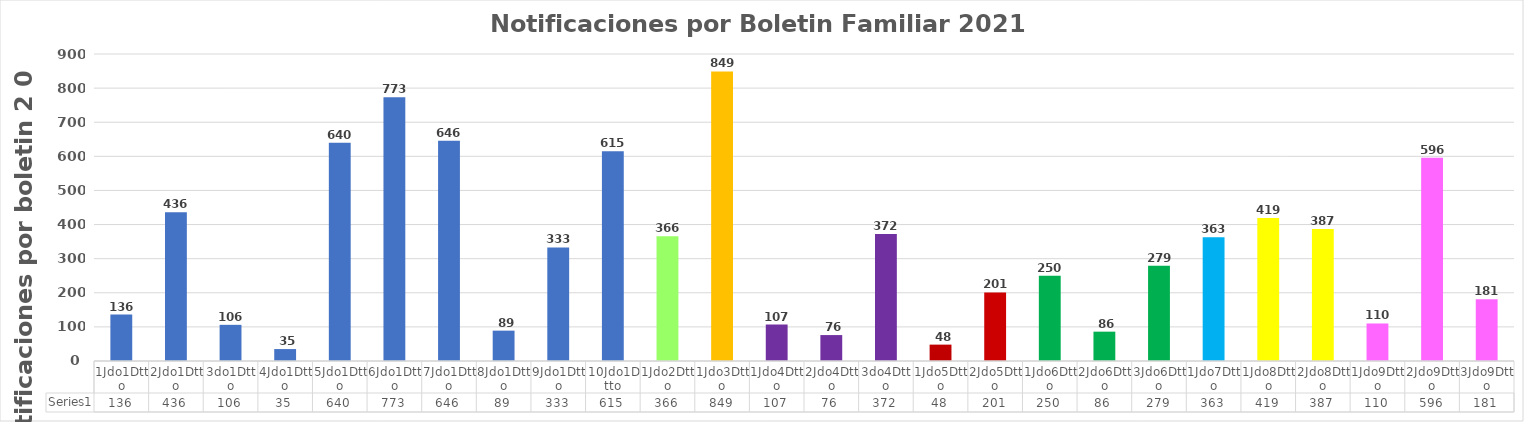
| Category | Series 0 |
|---|---|
| 1Jdo1Dtto | 136 |
| 2Jdo1Dtto | 436 |
| 3do1Dtto | 106 |
| 4Jdo1Dtto | 35 |
| 5Jdo1Dtto | 640 |
| 6Jdo1Dtto | 773 |
| 7Jdo1Dtto | 646 |
| 8Jdo1Dtto | 89 |
| 9Jdo1Dtto | 333 |
| 10Jdo1Dtto | 615 |
| 1Jdo2Dtto | 366 |
| 1Jdo3Dtto | 849 |
| 1Jdo4Dtto | 107 |
| 2Jdo4Dtto | 76 |
| 3do4Dtto | 372 |
| 1Jdo5Dtto | 48 |
| 2Jdo5Dtto | 201 |
| 1Jdo6Dtto | 250 |
| 2Jdo6Dtto | 86 |
| 3Jdo6Dtto | 279 |
| 1Jdo7Dtto | 363 |
| 1Jdo8Dtto | 419 |
| 2Jdo8Dtto | 387 |
| 1Jdo9Dtto | 110 |
| 2Jdo9Dtto | 596 |
| 3Jdo9Dtto | 181 |